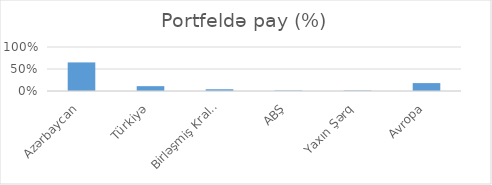
| Category | Series 0 |
|---|---|
| Azərbaycan | 0.65 |
| Türkiyə | 0.11 |
| Birləşmiş Krallıq | 0.04 |
| ABŞ | 0.01 |
| Yaxın Şərq | 0.01 |
| Avropa | 0.18 |